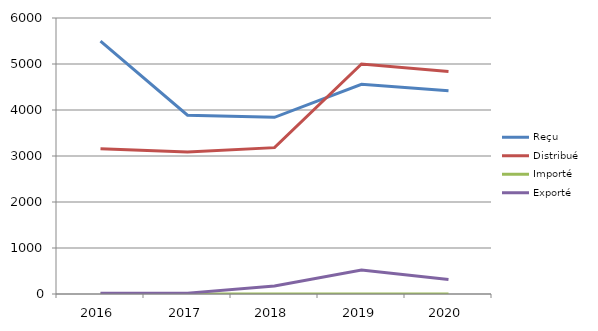
| Category | Reçu | Distribué | Importé | Exporté |
|---|---|---|---|---|
| 2016.0 | 5498 | 3159 | 0 | 17 |
| 2017.0 | 3887 | 3088 | 0 | 19 |
| 2018.0 | 3841 | 3182 | 0 | 172 |
| 2019.0 | 4560 | 5001 | 0 | 523 |
| 2020.0 | 4418 | 4839 | 0 | 313 |